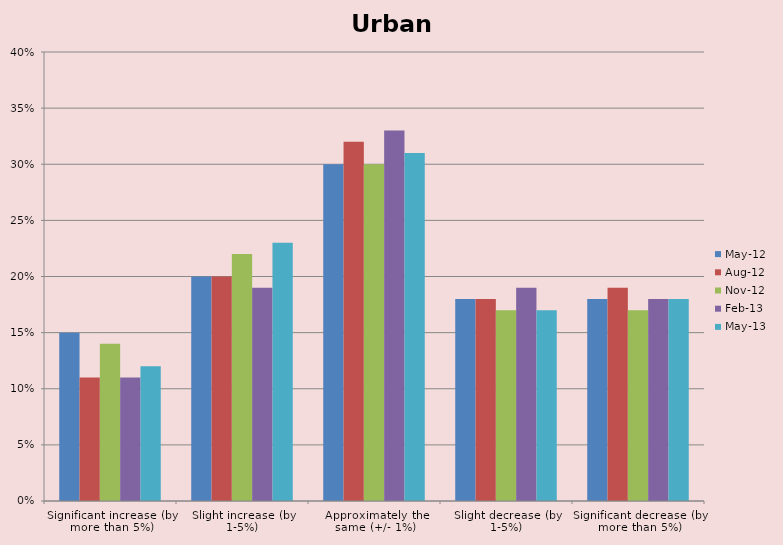
| Category | May-12 | Aug-12 | Nov-12 | Feb-13 | May-13 |
|---|---|---|---|---|---|
| Significant increase (by more than 5%) | 0.15 | 0.11 | 0.14 | 0.11 | 0.12 |
| Slight increase (by 1-5%) | 0.2 | 0.2 | 0.22 | 0.19 | 0.23 |
| Approximately the same (+/- 1%) | 0.3 | 0.32 | 0.3 | 0.33 | 0.31 |
| Slight decrease (by 1-5%) | 0.18 | 0.18 | 0.17 | 0.19 | 0.17 |
| Significant decrease (by more than 5%) | 0.18 | 0.19 | 0.17 | 0.18 | 0.18 |